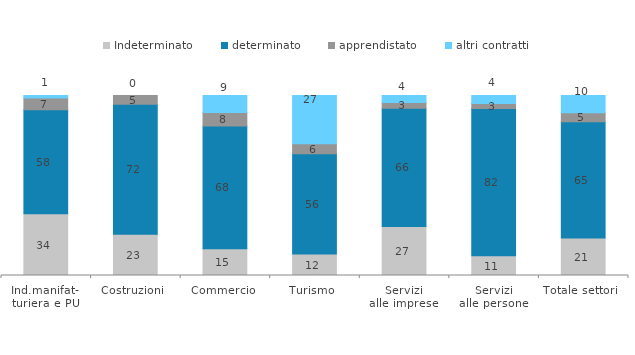
| Category | Indeterminato | determinato | apprendistato | altri contratti |
|---|---|---|---|---|
| Ind.manifat-
turiera e PU | 34.279 | 57.83 | 6.535 | 1.356 |
| Costruzioni | 22.977 | 72.168 | 4.854 | 0 |
| Commercio | 14.807 | 68.24 | 7.511 | 9.442 |
| Turismo | 11.978 | 55.626 | 5.626 | 26.77 |
| Servizi
alle imprese | 27.181 | 65.748 | 3.122 | 3.949 |
| Servizi
alle persone | 10.922 | 81.911 | 2.73 | 4.437 |
| Totale settori | 20.857 | 64.612 | 4.928 | 9.603 |